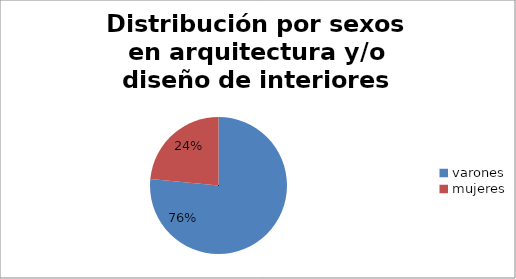
| Category | arquitectura |
|---|---|
| varones | 459 |
| mujeres | 141 |